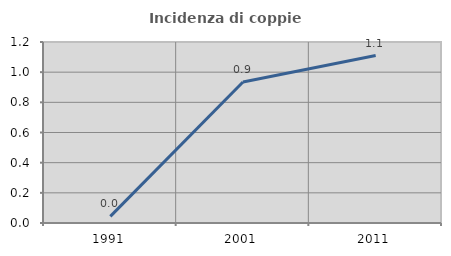
| Category | Incidenza di coppie miste |
|---|---|
| 1991.0 | 0.044 |
| 2001.0 | 0.935 |
| 2011.0 | 1.11 |